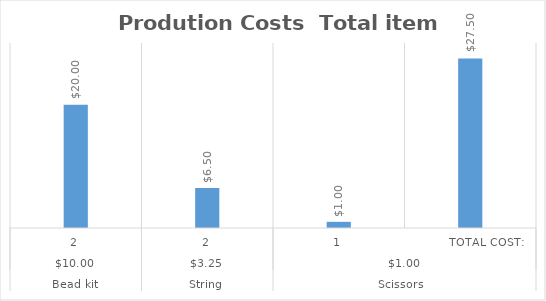
| Category |    Prodution Costs  |
|---|---|
| 0 | 20 |
| 1 | 6.5 |
| 2 | 1 |
| 3 | 27.5 |